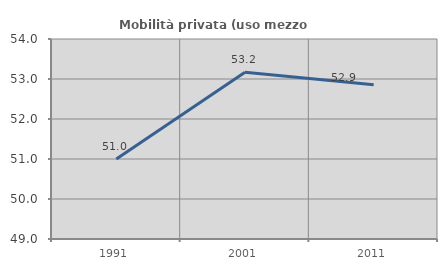
| Category | Mobilità privata (uso mezzo privato) |
|---|---|
| 1991.0 | 51.001 |
| 2001.0 | 53.17 |
| 2011.0 | 52.858 |